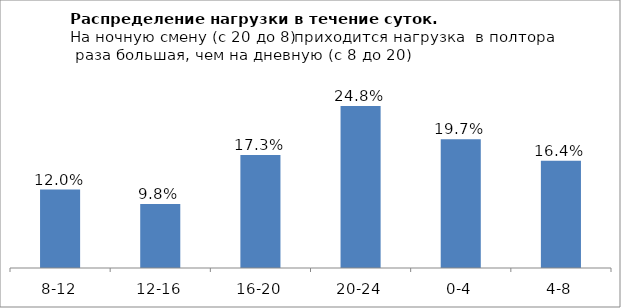
| Category | Series 0 |
|---|---|
| 8-12 | 0.12 |
| 12-16 | 0.098 |
| 16-20 | 0.173 |
| 20-24 | 0.248 |
| 0-4 | 0.197 |
| 4-8 | 0.164 |